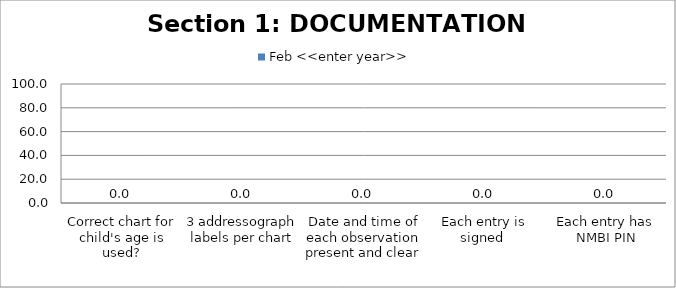
| Category | Feb <<enter year>> |
|---|---|
| Correct chart for child's age is used? | 0 |
| 3 addressograph labels per chart | 0 |
| Date and time of each observation present and clear  | 0 |
| Each entry is signed  | 0 |
| Each entry has NMBI PIN | 0 |